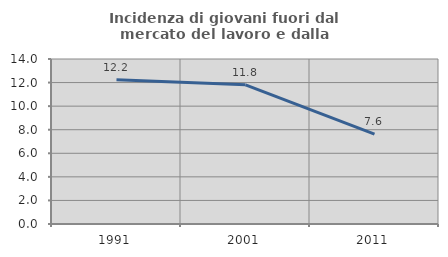
| Category | Incidenza di giovani fuori dal mercato del lavoro e dalla formazione  |
|---|---|
| 1991.0 | 12.245 |
| 2001.0 | 11.811 |
| 2011.0 | 7.619 |